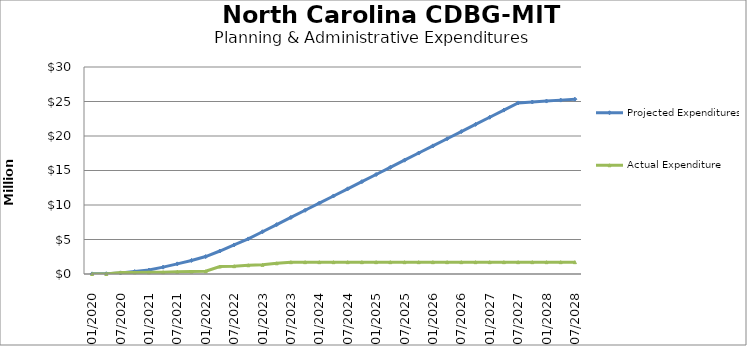
| Category | Projected Expenditures | Actual Expenditure |
|---|---|---|
| 01/2020 | 18934.446 | 0 |
| 04/2020 | 37847.561 | 0 |
| 07/2020 | 161413.244 | 222942.19 |
| 10/2020 | 353066.139 | 233141.15 |
| 01/2021 | 574980.018 | 240779.15 |
| 04/2021 | 993687.28 | 256066.95 |
| 07/2021 | 1469133.887 | 317236 |
| 10/2021 | 1967276.231 | 346652.92 |
| 01/2022 | 2525940.542 | 393251.51 |
| 04/2022 | 3331348.257 | 1084981.7 |
| 07/2022 | 4208625.807 | 1134493.7 |
| 10/2022 | 5085903.358 | 1265968.7 |
| 01/2023 | 6123018.358 | 1332367.7 |
| 04/2023 | 7160131.358 | 1551669.25 |
| 07/2023 | 8197244.358 | 1713080.4 |
| 10/2023 | 9234357.358 | 1715181.96 |
| 01/2024 | 10271470.358 | 1715181.96 |
| 04/2024 | 11308583.358 | 1715181.96 |
| 07/2024 | 12345696.358 | 1715181.96 |
| 10/2024 | 13382809.358 | 1715181.96 |
| 01/2025 | 14419922.358 | 1715181.96 |
| 04/2025 | 15457035.358 | 1715181.96 |
| 07/2025 | 16494148.358 | 1715181.96 |
| 10/2025 | 17531261.358 | 1715181.96 |
| 01/2026 | 18568374.358 | 1715181.96 |
| 04/2026 | 19605487.358 | 1715181.96 |
| 07/2026 | 20642600.358 | 1715181.96 |
| 10/2026 | 21679713.358 | 1715181.96 |
| 01/2027 | 22716826.358 | 1715181.96 |
| 04/2027 | 23753939.358 | 1715181.96 |
| 07/2027 | 24791052.358 | 1715181.96 |
| 10/2027 | 24927226.784 | 1715181.96 |
| 01/2028 | 25063401.21 | 1715181.96 |
| 04/2028 | 25199575.636 | 1715181.96 |
| 07/2028 | 25335750.061 | 1715181.96 |